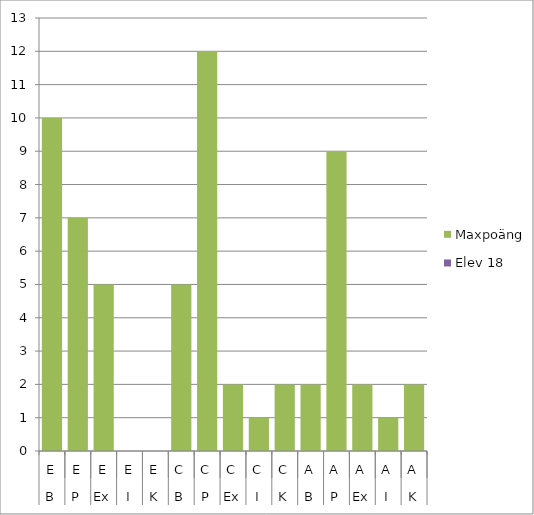
| Category | Maxpoäng | Elev 18 |
|---|---|---|
| 0 | 10 | 0 |
| 1 | 7 | 0 |
| 2 | 5 | 0 |
| 3 | 0 | 0 |
| 4 | 0 | 0 |
| 5 | 5 | 0 |
| 6 | 12 | 0 |
| 7 | 2 | 0 |
| 8 | 1 | 0 |
| 9 | 2 | 0 |
| 10 | 2 | 0 |
| 11 | 9 | 0 |
| 12 | 2 | 0 |
| 13 | 1 | 0 |
| 14 | 2 | 0 |